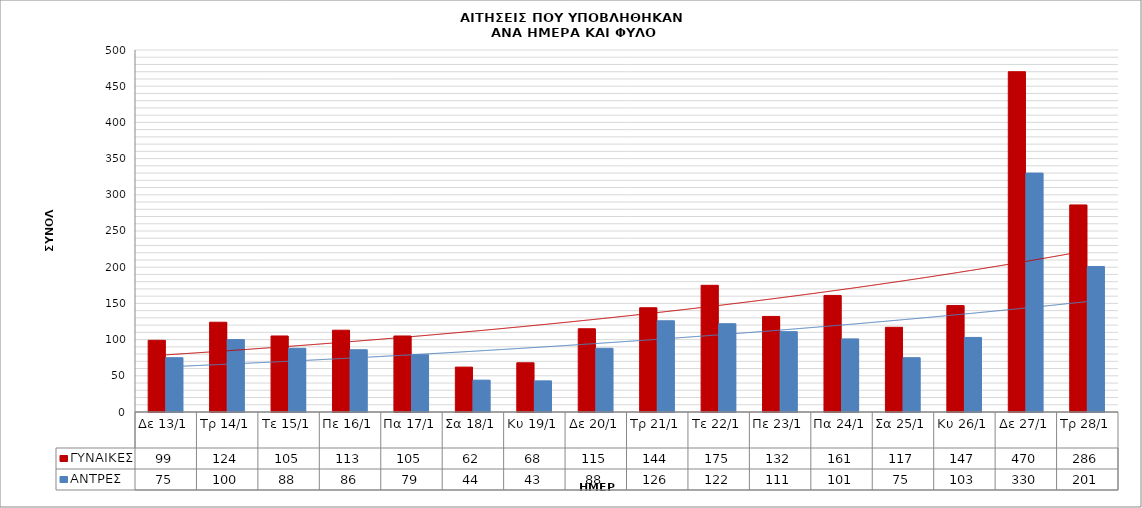
| Category | ΓΥΝΑΙΚΕΣ | ΑΝΤΡΕΣ |
|---|---|---|
| Δε 13/1 | 99 | 75 |
| Τρ 14/1 | 124 | 100 |
| Τε 15/1 | 105 | 88 |
| Πε 16/1 | 113 | 86 |
| Πα 17/1 | 105 | 79 |
| Σα 18/1 | 62 | 44 |
| Κυ 19/1 | 68 | 43 |
| Δε 20/1 | 115 | 88 |
| Τρ 21/1 | 144 | 126 |
| Τε 22/1 | 175 | 122 |
| Πε 23/1 | 132 | 111 |
| Πα 24/1 | 161 | 101 |
| Σα 25/1 | 117 | 75 |
| Κυ 26/1 | 147 | 103 |
| Δε 27/1 | 470 | 330 |
| Τρ 28/1 | 286 | 201 |